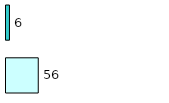
| Category | Series 0 | Series 1 |
|---|---|---|
| 0 | 56 | 6 |